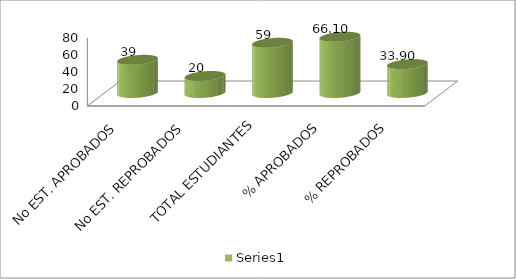
| Category | Series 0 |
|---|---|
| No EST. APROBADOS | 39 |
| No EST. REPROBADOS | 20 |
| TOTAL ESTUDIANTES | 59 |
| % APROBADOS | 66.102 |
| % REPROBADOS | 33.898 |